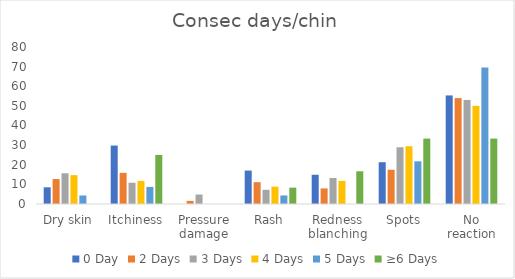
| Category | 0 Day | 2 Days | 3 Days | 4 Days | 5 Days | ≥6 Days |
|---|---|---|---|---|---|---|
| Dry skin | 8.511 | 12.698 | 15.663 | 14.706 | 4.348 | 0 |
| Itchiness | 29.787 | 15.873 | 10.843 | 11.765 | 8.696 | 25 |
| Pressure damage | 0 | 1.587 | 4.819 | 0 | 0 | 0 |
| Rash | 17.021 | 11.111 | 7.229 | 8.824 | 4.348 | 8.333 |
| Redness blanching | 14.894 | 7.937 | 13.253 | 11.765 | 0 | 16.667 |
| Spots | 21.277 | 17.46 | 28.916 | 29.412 | 21.739 | 33.333 |
| No reaction | 55.319 | 53.968 | 53.012 | 50 | 69.565 | 33.333 |